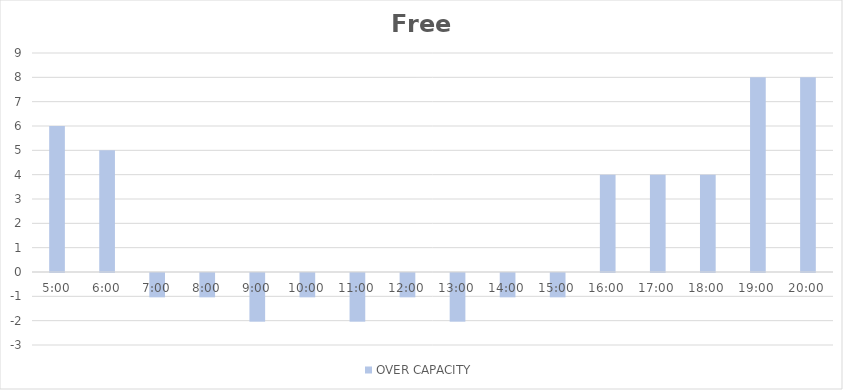
| Category | OVER CAPACITY |
|---|---|
| 0.20833333333333334 | 6 |
| 0.25 | 5 |
| 0.2916666666666667 | -1 |
| 0.3333333333333333 | -1 |
| 0.375 | -2 |
| 0.4166666666666667 | -1 |
| 0.4583333333333333 | -2 |
| 0.5 | -1 |
| 0.5416666666666666 | -2 |
| 0.5833333333333334 | -1 |
| 0.625 | -1 |
| 0.6666666666666666 | 4 |
| 0.7083333333333334 | 4 |
| 0.75 | 4 |
| 0.7916666666666666 | 8 |
| 0.8333333333333334 | 8 |